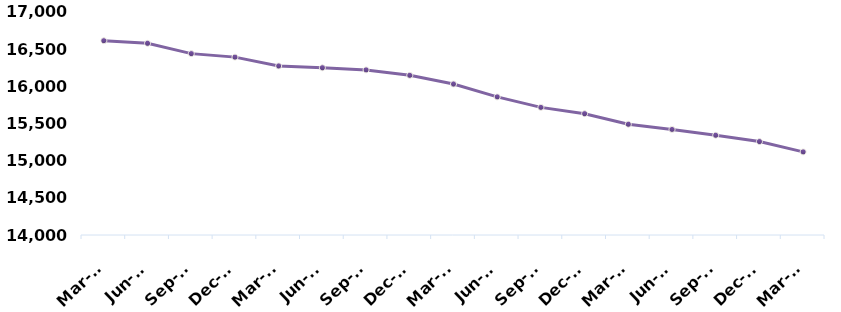
| Category | Total |
|---|---|
| Mar-15 | 16614 |
| Jun-15 | 16579 |
| Sep-15 | 16440 |
| Dec-15 | 16393 |
| Mar-16 | 16274 |
| Jun-16 | 16250 |
| Sep-16 | 16221 |
| Dec-16 | 16148 |
| Mar-17 | 16031 |
| Jun-17 | 15858 |
| Sep-17 | 15717 |
| Dec-17 | 15632 |
| Mar-18 | 15490 |
| Jun-18 | 15420 |
| Sep-18 | 15342 |
| Dec-18 | 15257 |
| Mar-19 | 15118 |